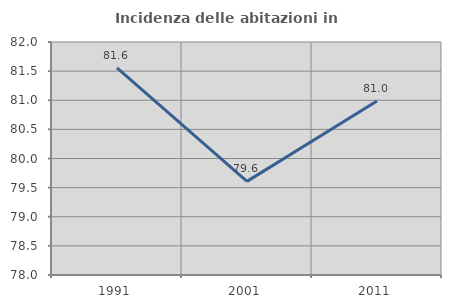
| Category | Incidenza delle abitazioni in proprietà  |
|---|---|
| 1991.0 | 81.557 |
| 2001.0 | 79.607 |
| 2011.0 | 80.987 |